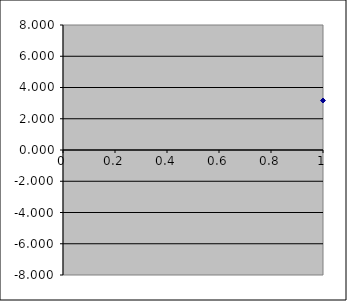
| Category | Series 0 |
|---|---|
| 0 | 3.167 |
| 1 | 0.167 |
| 2 | 7.167 |
| 3 | 0 |
| 4 | 0 |
| 5 | 4 |
| 6 | 0 |
| 7 | 0 |
| 8 | 0 |
| 9 | 0 |
| 10 | -5.833 |
| 11 | -4.833 |
| 12 | 0.167 |
| 13 | 0 |
| 14 | 0 |
| 15 | -1 |
| 16 | 0 |
| 17 | -3 |
| 18 | 0 |
| 19 | 0 |